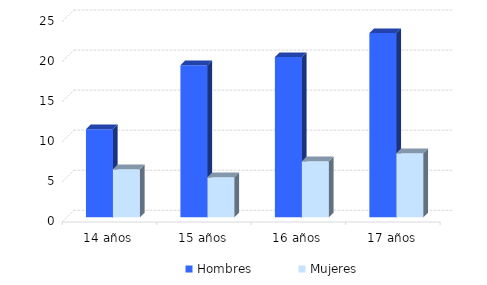
| Category | Hombres | Mujeres |
|---|---|---|
| 14 años | 11 | 6 |
| 15 años | 19 | 5 |
| 16 años | 20 | 7 |
| 17 años | 23 | 8 |